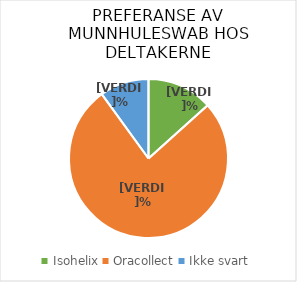
| Category | Antall svar i % |
|---|---|
| Isohelix | 13.333 |
| Oracollect | 76.667 |
| Ikke svart | 10 |